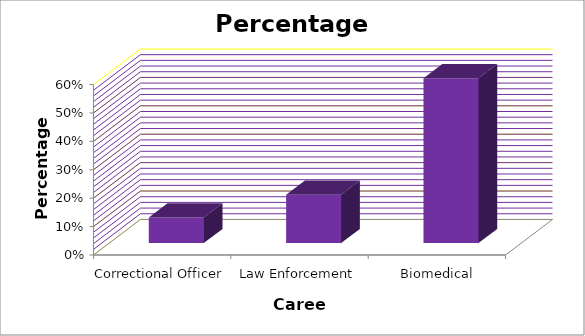
| Category | Series 0 |
|---|---|
| Correctional Officer | 0.09 |
| Law Enforcement | 0.17 |
| Biomedical Engineer | 0.58 |